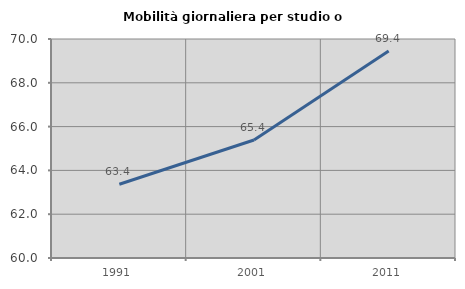
| Category | Mobilità giornaliera per studio o lavoro |
|---|---|
| 1991.0 | 63.369 |
| 2001.0 | 65.388 |
| 2011.0 | 69.447 |